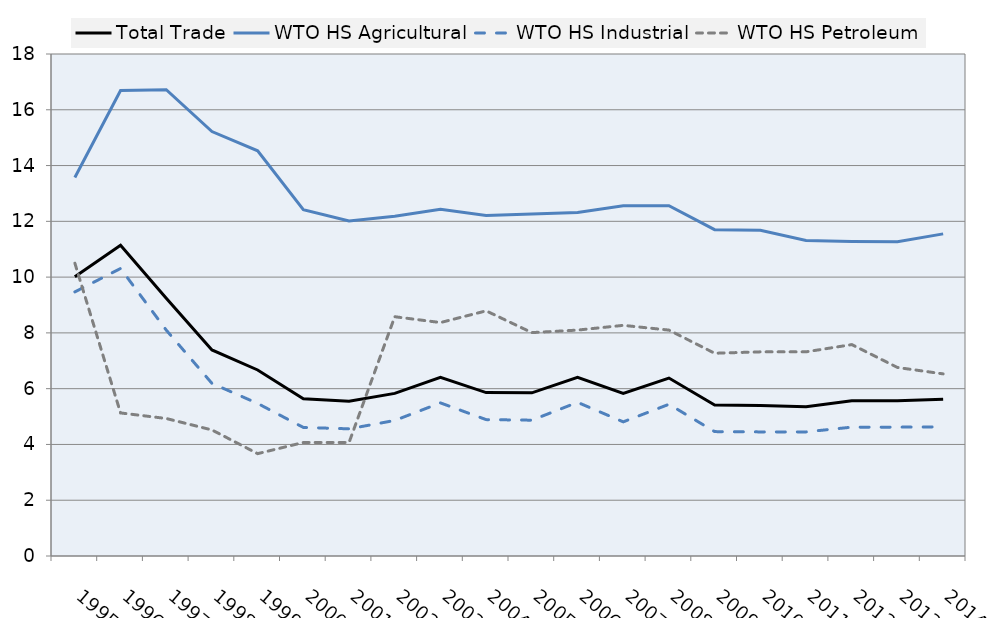
| Category | Total Trade | WTO HS Agricultural | WTO HS Industrial | WTO HS Petroleum |
|---|---|---|---|---|
| 1995.0 | 10.01 | 13.57 | 9.47 | 10.5 |
| 1996.0 | 11.14 | 16.69 | 10.31 | 5.13 |
| 1997.0 | 9.24 | 16.72 | 8.1 | 4.93 |
| 1998.0 | 7.39 | 15.22 | 6.19 | 4.52 |
| 1999.0 | 6.67 | 14.53 | 5.47 | 3.67 |
| 2000.0 | 5.64 | 12.42 | 4.61 | 4.07 |
| 2001.0 | 5.55 | 12.01 | 4.56 | 4.07 |
| 2002.0 | 5.83 | 12.18 | 4.86 | 8.58 |
| 2003.0 | 6.41 | 12.43 | 5.49 | 8.37 |
| 2004.0 | 5.86 | 12.21 | 4.89 | 8.79 |
| 2005.0 | 5.85 | 12.26 | 4.87 | 8.01 |
| 2006.0 | 6.41 | 12.32 | 5.51 | 8.1 |
| 2007.0 | 5.83 | 12.56 | 4.81 | 8.27 |
| 2008.0 | 6.38 | 12.56 | 5.44 | 8.1 |
| 2009.0 | 5.41 | 11.7 | 4.46 | 7.27 |
| 2010.0 | 5.4 | 11.68 | 4.45 | 7.32 |
| 2011.0 | 5.35 | 11.31 | 4.45 | 7.32 |
| 2012.0 | 5.57 | 11.28 | 4.62 | 7.58 |
| 2013.0 | 5.57 | 11.27 | 4.62 | 6.76 |
| 2014.0 | 5.62 | 11.55 | 4.63 | 6.53 |